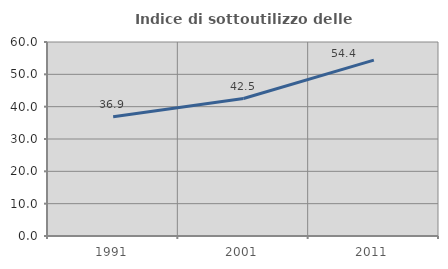
| Category | Indice di sottoutilizzo delle abitazioni  |
|---|---|
| 1991.0 | 36.86 |
| 2001.0 | 42.509 |
| 2011.0 | 54.406 |